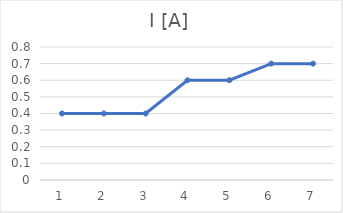
| Category | I [A] |
|---|---|
| 0 | 0.4 |
| 1 | 0.4 |
| 2 | 0.4 |
| 3 | 0.6 |
| 4 | 0.6 |
| 5 | 0.7 |
| 6 | 0.7 |